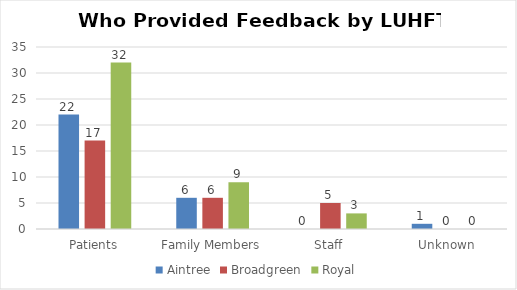
| Category | Aintree | Broadgreen | Royal |
|---|---|---|---|
| Patients | 22 | 17 | 32 |
| Family Members | 6 | 6 | 9 |
| Staff | 0 | 5 | 3 |
| Unknown | 1 | 0 | 0 |